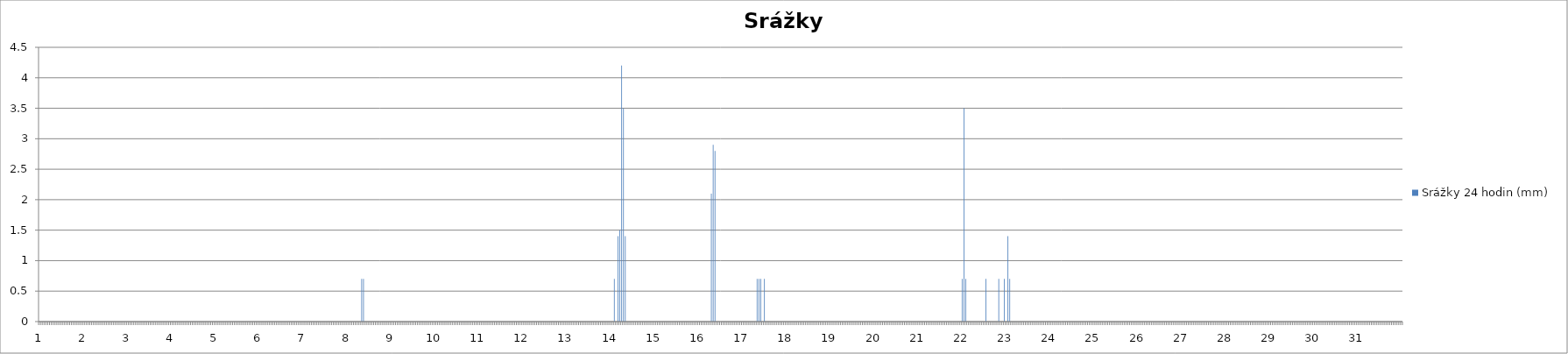
| Category | Srážky 24 hodin (mm) |
|---|---|
| 0 | 0 |
| 1 | 0 |
| 2 | 0 |
| 3 | 0 |
| 4 | 0 |
| 5 | 0 |
| 6 | 0 |
| 7 | 0 |
| 8 | 0 |
| 9 | 0 |
| 10 | 0 |
| 11 | 0 |
| 12 | 0 |
| 13 | 0 |
| 14 | 0 |
| 15 | 0 |
| 16 | 0 |
| 17 | 0 |
| 18 | 0 |
| 19 | 0 |
| 20 | 0 |
| 21 | 0 |
| 22 | 0 |
| 23 | 0 |
| 24 | 0 |
| 25 | 0 |
| 26 | 0 |
| 27 | 0 |
| 28 | 0 |
| 29 | 0 |
| 30 | 0 |
| 31 | 0 |
| 32 | 0 |
| 33 | 0 |
| 34 | 0 |
| 35 | 0 |
| 36 | 0 |
| 37 | 0 |
| 38 | 0 |
| 39 | 0 |
| 40 | 0 |
| 41 | 0 |
| 42 | 0 |
| 43 | 0 |
| 44 | 0 |
| 45 | 0 |
| 46 | 0 |
| 47 | 0 |
| 48 | 0 |
| 49 | 0 |
| 50 | 0 |
| 51 | 0 |
| 52 | 0 |
| 53 | 0 |
| 54 | 0 |
| 55 | 0 |
| 56 | 0 |
| 57 | 0 |
| 58 | 0 |
| 59 | 0 |
| 60 | 0 |
| 61 | 0 |
| 62 | 0 |
| 63 | 0 |
| 64 | 0 |
| 65 | 0 |
| 66 | 0 |
| 67 | 0 |
| 68 | 0 |
| 69 | 0 |
| 70 | 0 |
| 71 | 0 |
| 72 | 0 |
| 73 | 0 |
| 74 | 0 |
| 75 | 0 |
| 76 | 0 |
| 77 | 0 |
| 78 | 0 |
| 79 | 0 |
| 80 | 0 |
| 81 | 0 |
| 82 | 0 |
| 83 | 0 |
| 84 | 0 |
| 85 | 0 |
| 86 | 0 |
| 87 | 0 |
| 88 | 0 |
| 89 | 0 |
| 90 | 0 |
| 91 | 0 |
| 92 | 0 |
| 93 | 0 |
| 94 | 0 |
| 95 | 0 |
| 96 | 0 |
| 97 | 0 |
| 98 | 0 |
| 99 | 0 |
| 100 | 0 |
| 101 | 0 |
| 102 | 0 |
| 103 | 0 |
| 104 | 0 |
| 105 | 0 |
| 106 | 0 |
| 107 | 0 |
| 108 | 0 |
| 109 | 0 |
| 110 | 0 |
| 111 | 0 |
| 112 | 0 |
| 113 | 0 |
| 114 | 0 |
| 115 | 0 |
| 116 | 0 |
| 117 | 0 |
| 118 | 0 |
| 119 | 0 |
| 120 | 0 |
| 121 | 0 |
| 122 | 0 |
| 123 | 0 |
| 124 | 0 |
| 125 | 0 |
| 126 | 0 |
| 127 | 0 |
| 128 | 0 |
| 129 | 0 |
| 130 | 0 |
| 131 | 0 |
| 132 | 0 |
| 133 | 0 |
| 134 | 0 |
| 135 | 0 |
| 136 | 0 |
| 137 | 0 |
| 138 | 0 |
| 139 | 0 |
| 140 | 0 |
| 141 | 0 |
| 142 | 0 |
| 143 | 0 |
| 144 | 0 |
| 145 | 0 |
| 146 | 0 |
| 147 | 0 |
| 148 | 0 |
| 149 | 0 |
| 150 | 0 |
| 151 | 0 |
| 152 | 0 |
| 153 | 0 |
| 154 | 0 |
| 155 | 0 |
| 156 | 0 |
| 157 | 0 |
| 158 | 0 |
| 159 | 0 |
| 160 | 0 |
| 161 | 0 |
| 162 | 0 |
| 163 | 0 |
| 164 | 0 |
| 165 | 0 |
| 166 | 0 |
| 167 | 0 |
| 168 | 0 |
| 169 | 0 |
| 170 | 0 |
| 171 | 0 |
| 172 | 0 |
| 173 | 0 |
| 174 | 0 |
| 175 | 0 |
| 176 | 0.7 |
| 177 | 0.7 |
| 178 | 0 |
| 179 | 0 |
| 180 | 0 |
| 181 | 0 |
| 182 | 0 |
| 183 | 0 |
| 184 | 0 |
| 185 | 0 |
| 186 | 0 |
| 187 | 0 |
| 188 | 0 |
| 189 | 0 |
| 190 | 0 |
| 191 | 0 |
| 192 | 0 |
| 193 | 0 |
| 194 | 0 |
| 195 | 0 |
| 196 | 0 |
| 197 | 0 |
| 198 | 0 |
| 199 | 0 |
| 200 | 0 |
| 201 | 0 |
| 202 | 0 |
| 203 | 0 |
| 204 | 0 |
| 205 | 0 |
| 206 | 0 |
| 207 | 0 |
| 208 | 0 |
| 209 | 0 |
| 210 | 0 |
| 211 | 0 |
| 212 | 0 |
| 213 | 0 |
| 214 | 0 |
| 215 | 0 |
| 216 | 0 |
| 217 | 0 |
| 218 | 0 |
| 219 | 0 |
| 220 | 0 |
| 221 | 0 |
| 222 | 0 |
| 223 | 0 |
| 224 | 0 |
| 225 | 0 |
| 226 | 0 |
| 227 | 0 |
| 228 | 0 |
| 229 | 0 |
| 230 | 0 |
| 231 | 0 |
| 232 | 0 |
| 233 | 0 |
| 234 | 0 |
| 235 | 0 |
| 236 | 0 |
| 237 | 0 |
| 238 | 0 |
| 239 | 0 |
| 240 | 0 |
| 241 | 0 |
| 242 | 0 |
| 243 | 0 |
| 244 | 0 |
| 245 | 0 |
| 246 | 0 |
| 247 | 0 |
| 248 | 0 |
| 249 | 0 |
| 250 | 0 |
| 251 | 0 |
| 252 | 0 |
| 253 | 0 |
| 254 | 0 |
| 255 | 0 |
| 256 | 0 |
| 257 | 0 |
| 258 | 0 |
| 259 | 0 |
| 260 | 0 |
| 261 | 0 |
| 262 | 0 |
| 263 | 0 |
| 264 | 0 |
| 265 | 0 |
| 266 | 0 |
| 267 | 0 |
| 268 | 0 |
| 269 | 0 |
| 270 | 0 |
| 271 | 0 |
| 272 | 0 |
| 273 | 0 |
| 274 | 0 |
| 275 | 0 |
| 276 | 0 |
| 277 | 0 |
| 278 | 0 |
| 279 | 0 |
| 280 | 0 |
| 281 | 0 |
| 282 | 0 |
| 283 | 0 |
| 284 | 0 |
| 285 | 0 |
| 286 | 0 |
| 287 | 0 |
| 288 | 0 |
| 289 | 0 |
| 290 | 0 |
| 291 | 0 |
| 292 | 0 |
| 293 | 0 |
| 294 | 0 |
| 295 | 0 |
| 296 | 0 |
| 297 | 0 |
| 298 | 0 |
| 299 | 0 |
| 300 | 0 |
| 301 | 0 |
| 302 | 0 |
| 303 | 0 |
| 304 | 0 |
| 305 | 0 |
| 306 | 0 |
| 307 | 0 |
| 308 | 0 |
| 309 | 0 |
| 310 | 0 |
| 311 | 0 |
| 312 | 0 |
| 313 | 0 |
| 314 | 0.7 |
| 315 | 0 |
| 316 | 1.4 |
| 317 | 1.5 |
| 318 | 4.2 |
| 319 | 3.5 |
| 320 | 1.4 |
| 321 | 0 |
| 322 | 0 |
| 323 | 0 |
| 324 | 0 |
| 325 | 0 |
| 326 | 0 |
| 327 | 0 |
| 328 | 0 |
| 329 | 0 |
| 330 | 0 |
| 331 | 0 |
| 332 | 0 |
| 333 | 0 |
| 334 | 0 |
| 335 | 0 |
| 336 | 0 |
| 337 | 0 |
| 338 | 0 |
| 339 | 0 |
| 340 | 0 |
| 341 | 0 |
| 342 | 0 |
| 343 | 0 |
| 344 | 0 |
| 345 | 0 |
| 346 | 0 |
| 347 | 0 |
| 348 | 0 |
| 349 | 0 |
| 350 | 0 |
| 351 | 0 |
| 352 | 0 |
| 353 | 0 |
| 354 | 0 |
| 355 | 0 |
| 356 | 0 |
| 357 | 0 |
| 358 | 0 |
| 359 | 0 |
| 360 | 0 |
| 361 | 0 |
| 362 | 0 |
| 363 | 0 |
| 364 | 0 |
| 365 | 0 |
| 366 | 0 |
| 367 | 2.1 |
| 368 | 2.9 |
| 369 | 2.8 |
| 370 | 0 |
| 371 | 0 |
| 372 | 0 |
| 373 | 0 |
| 374 | 0 |
| 375 | 0 |
| 376 | 0 |
| 377 | 0 |
| 378 | 0 |
| 379 | 0 |
| 380 | 0 |
| 381 | 0 |
| 382 | 0 |
| 383 | 0 |
| 384 | 0 |
| 385 | 0 |
| 386 | 0 |
| 387 | 0 |
| 388 | 0 |
| 389 | 0 |
| 390 | 0 |
| 391 | 0 |
| 392 | 0.7 |
| 393 | 0.7 |
| 394 | 0.7 |
| 395 | 0 |
| 396 | 0.7 |
| 397 | 0 |
| 398 | 0 |
| 399 | 0 |
| 400 | 0 |
| 401 | 0 |
| 402 | 0 |
| 403 | 0 |
| 404 | 0 |
| 405 | 0 |
| 406 | 0 |
| 407 | 0 |
| 408 | 0 |
| 409 | 0 |
| 410 | 0 |
| 411 | 0 |
| 412 | 0 |
| 413 | 0 |
| 414 | 0 |
| 415 | 0 |
| 416 | 0 |
| 417 | 0 |
| 418 | 0 |
| 419 | 0 |
| 420 | 0 |
| 421 | 0 |
| 422 | 0 |
| 423 | 0 |
| 424 | 0 |
| 425 | 0 |
| 426 | 0 |
| 427 | 0 |
| 428 | 0 |
| 429 | 0 |
| 430 | 0 |
| 431 | 0 |
| 432 | 0 |
| 433 | 0 |
| 434 | 0 |
| 435 | 0 |
| 436 | 0 |
| 437 | 0 |
| 438 | 0 |
| 439 | 0 |
| 440 | 0 |
| 441 | 0 |
| 442 | 0 |
| 443 | 0 |
| 444 | 0 |
| 445 | 0 |
| 446 | 0 |
| 447 | 0 |
| 448 | 0 |
| 449 | 0 |
| 450 | 0 |
| 451 | 0 |
| 452 | 0 |
| 453 | 0 |
| 454 | 0 |
| 455 | 0 |
| 456 | 0 |
| 457 | 0 |
| 458 | 0 |
| 459 | 0 |
| 460 | 0 |
| 461 | 0 |
| 462 | 0 |
| 463 | 0 |
| 464 | 0 |
| 465 | 0 |
| 466 | 0 |
| 467 | 0 |
| 468 | 0 |
| 469 | 0 |
| 470 | 0 |
| 471 | 0 |
| 472 | 0 |
| 473 | 0 |
| 474 | 0 |
| 475 | 0 |
| 476 | 0 |
| 477 | 0 |
| 478 | 0 |
| 479 | 0 |
| 480 | 0 |
| 481 | 0 |
| 482 | 0 |
| 483 | 0 |
| 484 | 0 |
| 485 | 0 |
| 486 | 0 |
| 487 | 0 |
| 488 | 0 |
| 489 | 0 |
| 490 | 0 |
| 491 | 0 |
| 492 | 0 |
| 493 | 0 |
| 494 | 0 |
| 495 | 0 |
| 496 | 0 |
| 497 | 0 |
| 498 | 0 |
| 499 | 0 |
| 500 | 0 |
| 501 | 0 |
| 502 | 0 |
| 503 | 0 |
| 504 | 0.7 |
| 505 | 3.5 |
| 506 | 0.7 |
| 507 | 0 |
| 508 | 0 |
| 509 | 0 |
| 510 | 0 |
| 511 | 0 |
| 512 | 0 |
| 513 | 0 |
| 514 | 0 |
| 515 | 0 |
| 516 | 0 |
| 517 | 0.7 |
| 518 | 0 |
| 519 | 0 |
| 520 | 0 |
| 521 | 0 |
| 522 | 0 |
| 523 | 0 |
| 524 | 0.7 |
| 525 | 0 |
| 526 | 0 |
| 527 | 0.7 |
| 528 | 0 |
| 529 | 1.4 |
| 530 | 0.7 |
| 531 | 0 |
| 532 | 0 |
| 533 | 0 |
| 534 | 0 |
| 535 | 0 |
| 536 | 0 |
| 537 | 0 |
| 538 | 0 |
| 539 | 0 |
| 540 | 0 |
| 541 | 0 |
| 542 | 0 |
| 543 | 0 |
| 544 | 0 |
| 545 | 0 |
| 546 | 0 |
| 547 | 0 |
| 548 | 0 |
| 549 | 0 |
| 550 | 0 |
| 551 | 0 |
| 552 | 0 |
| 553 | 0 |
| 554 | 0 |
| 555 | 0 |
| 556 | 0 |
| 557 | 0 |
| 558 | 0 |
| 559 | 0 |
| 560 | 0 |
| 561 | 0 |
| 562 | 0 |
| 563 | 0 |
| 564 | 0 |
| 565 | 0 |
| 566 | 0 |
| 567 | 0 |
| 568 | 0 |
| 569 | 0 |
| 570 | 0 |
| 571 | 0 |
| 572 | 0 |
| 573 | 0 |
| 574 | 0 |
| 575 | 0 |
| 576 | 0 |
| 577 | 0 |
| 578 | 0 |
| 579 | 0 |
| 580 | 0 |
| 581 | 0 |
| 582 | 0 |
| 583 | 0 |
| 584 | 0 |
| 585 | 0 |
| 586 | 0 |
| 587 | 0 |
| 588 | 0 |
| 589 | 0 |
| 590 | 0 |
| 591 | 0 |
| 592 | 0 |
| 593 | 0 |
| 594 | 0 |
| 595 | 0 |
| 596 | 0 |
| 597 | 0 |
| 598 | 0 |
| 599 | 0 |
| 600 | 0 |
| 601 | 0 |
| 602 | 0 |
| 603 | 0 |
| 604 | 0 |
| 605 | 0 |
| 606 | 0 |
| 607 | 0 |
| 608 | 0 |
| 609 | 0 |
| 610 | 0 |
| 611 | 0 |
| 612 | 0 |
| 613 | 0 |
| 614 | 0 |
| 615 | 0 |
| 616 | 0 |
| 617 | 0 |
| 618 | 0 |
| 619 | 0 |
| 620 | 0 |
| 621 | 0 |
| 622 | 0 |
| 623 | 0 |
| 624 | 0 |
| 625 | 0 |
| 626 | 0 |
| 627 | 0 |
| 628 | 0 |
| 629 | 0 |
| 630 | 0 |
| 631 | 0 |
| 632 | 0 |
| 633 | 0 |
| 634 | 0 |
| 635 | 0 |
| 636 | 0 |
| 637 | 0 |
| 638 | 0 |
| 639 | 0 |
| 640 | 0 |
| 641 | 0 |
| 642 | 0 |
| 643 | 0 |
| 644 | 0 |
| 645 | 0 |
| 646 | 0 |
| 647 | 0 |
| 648 | 0 |
| 649 | 0 |
| 650 | 0 |
| 651 | 0 |
| 652 | 0 |
| 653 | 0 |
| 654 | 0 |
| 655 | 0 |
| 656 | 0 |
| 657 | 0 |
| 658 | 0 |
| 659 | 0 |
| 660 | 0 |
| 661 | 0 |
| 662 | 0 |
| 663 | 0 |
| 664 | 0 |
| 665 | 0 |
| 666 | 0 |
| 667 | 0 |
| 668 | 0 |
| 669 | 0 |
| 670 | 0 |
| 671 | 0 |
| 672 | 0 |
| 673 | 0 |
| 674 | 0 |
| 675 | 0 |
| 676 | 0 |
| 677 | 0 |
| 678 | 0 |
| 679 | 0 |
| 680 | 0 |
| 681 | 0 |
| 682 | 0 |
| 683 | 0 |
| 684 | 0 |
| 685 | 0 |
| 686 | 0 |
| 687 | 0 |
| 688 | 0 |
| 689 | 0 |
| 690 | 0 |
| 691 | 0 |
| 692 | 0 |
| 693 | 0 |
| 694 | 0 |
| 695 | 0 |
| 696 | 0 |
| 697 | 0 |
| 698 | 0 |
| 699 | 0 |
| 700 | 0 |
| 701 | 0 |
| 702 | 0 |
| 703 | 0 |
| 704 | 0 |
| 705 | 0 |
| 706 | 0 |
| 707 | 0 |
| 708 | 0 |
| 709 | 0 |
| 710 | 0 |
| 711 | 0 |
| 712 | 0 |
| 713 | 0 |
| 714 | 0 |
| 715 | 0 |
| 716 | 0 |
| 717 | 0 |
| 718 | 0 |
| 719 | 0 |
| 720 | 0 |
| 721 | 0 |
| 722 | 0 |
| 723 | 0 |
| 724 | 0 |
| 725 | 0 |
| 726 | 0 |
| 727 | 0 |
| 728 | 0 |
| 729 | 0 |
| 730 | 0 |
| 731 | 0 |
| 732 | 0 |
| 733 | 0 |
| 734 | 0 |
| 735 | 0 |
| 736 | 0 |
| 737 | 0 |
| 738 | 0 |
| 739 | 0 |
| 740 | 0 |
| 741 | 0 |
| 742 | 0 |
| 743 | 0 |
| 744 | 0 |